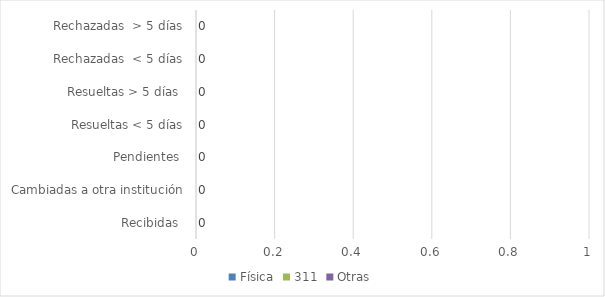
| Category | Física | 311 | Otras |
|---|---|---|---|
| Recibidas  | 0 | 0 | 0 |
| Cambiadas a otra institución | 0 | 0 | 0 |
| Pendientes  | 0 | 0 | 0 |
| Resueltas < 5 días | 0 | 0 | 0 |
| Resueltas > 5 días  | 0 | 0 | 0 |
| Rechazadas  < 5 días | 0 | 0 | 0 |
| Rechazadas  > 5 días | 0 | 0 | 0 |